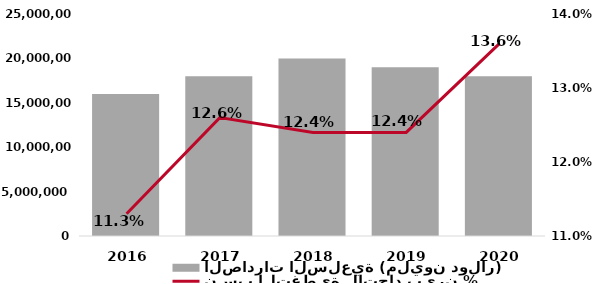
| Category | الصادرات السلعية (مليون دولار) |
|---|---|
| 2016.0 | 16000000 |
| 2017.0 | 18000000 |
| 2018.0 | 20000000 |
| 2019.0 | 19000000 |
| 2020.0 | 18000000 |